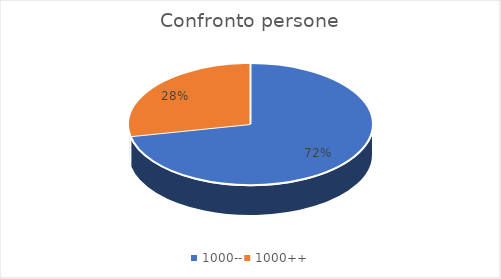
| Category | Series 0 |
|---|---|
| 1000-- | 245 |
| 1000++ | 96 |